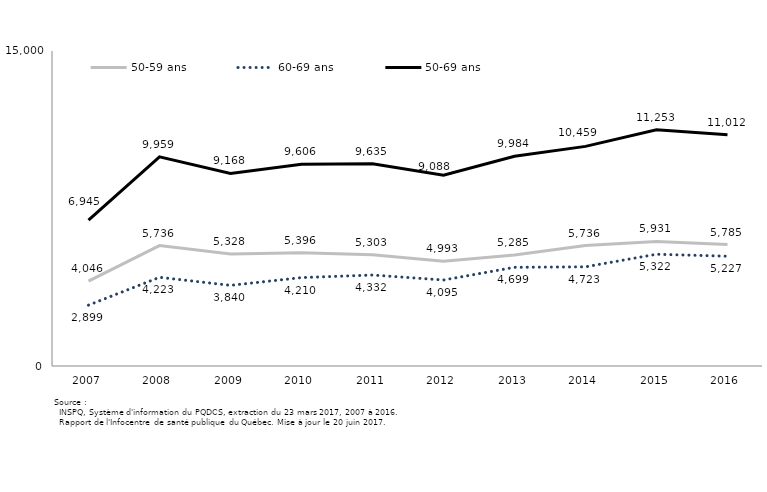
| Category | 50-59 ans | 60-69 ans | 50-69 ans |
|---|---|---|---|
| 2007.0 | 4046 | 2899 | 6945 |
| 2008.0 | 5736 | 4223 | 9959 |
| 2009.0 | 5328 | 3840 | 9168 |
| 2010.0 | 5396 | 4210 | 9606 |
| 2011.0 | 5303 | 4332 | 9635 |
| 2012.0 | 4993 | 4095 | 9088 |
| 2013.0 | 5285 | 4699 | 9984 |
| 2014.0 | 5736 | 4723 | 10459 |
| 2015.0 | 5931 | 5322 | 11253 |
| 2016.0 | 5785 | 5227 | 11012 |